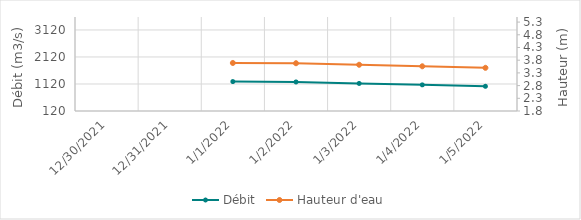
| Category | Débit |
|---|---|
| 8/1/21 | 854.67 |
| 7/31/21 | 839.16 |
| 7/30/21 | 838.9 |
| 7/29/21 | 811.17 |
| 7/28/21 | 751.25 |
| 7/27/21 | 775.59 |
| 7/26/21 | 766.9 |